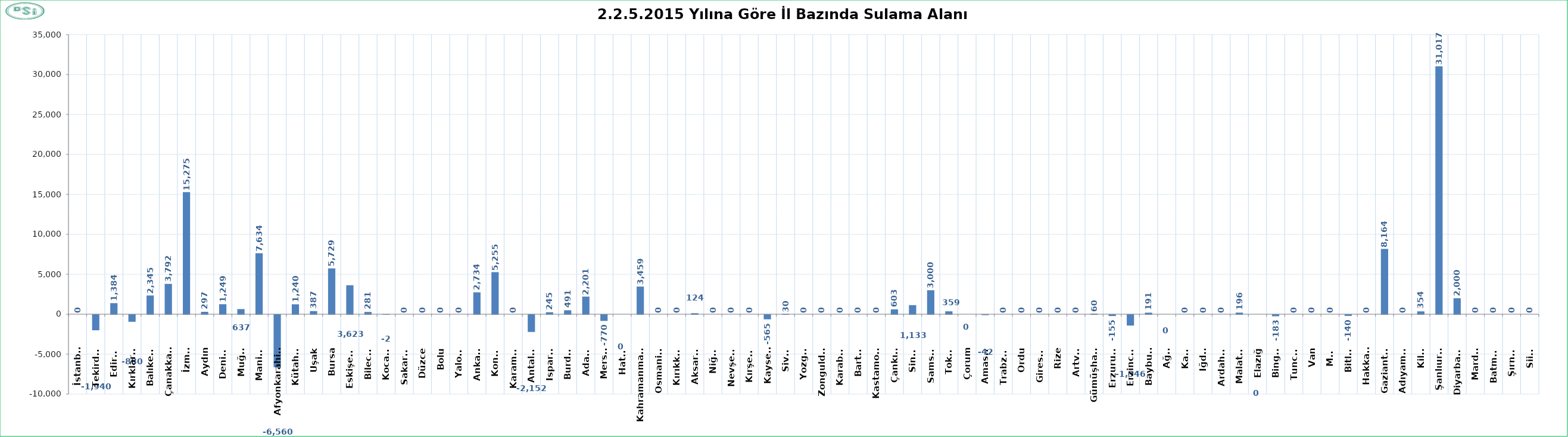
| Category | Series 0 |
|---|---|
| İstanbul | 0 |
| Tekirdağ | -1940 |
| Edirne | 1384 |
| Kırklareli | -880 |
| Balıkesir | 2345 |
| Çanakkale | 3792 |
| İzmir | 15275 |
| Aydın | 297 |
| Denizli | 1249 |
| Muğla | 637 |
| Manisa | 7634 |
| Afyonkarahisar | -6560 |
| Kütahya | 1240 |
| Uşak | 387 |
| Bursa | 5729 |
| Eskişehir | 3623 |
| Bilecik | 281 |
| Kocaeli | -2 |
| Sakarya | 0 |
| Düzce | 0 |
| Bolu | 0 |
| Yalova | 0 |
| Ankara | 2734 |
| Konya | 5255 |
| Karaman | 0 |
| Antalya | -2152 |
| Isparta | 245 |
| Burdur | 491 |
| Adana | 2201 |
| Mersin | -770 |
| Hatay | 0 |
| Kahramanmaraş | 3459 |
| Osmaniye | 0 |
| Kırıkkale | 0 |
| Aksaray | 124 |
| Niğde | 0 |
| Nevşehir | 0 |
| Kırşehir | 0 |
| Kayseri | -565 |
| Sivas | 30 |
| Yozgat | 0 |
| Zonguldak | 0 |
| Karabük | 0 |
| Bartın | 0 |
| Kastamonu | 0 |
| Çankırı | 603 |
| Sinop | 1133 |
| Samsun | 3000 |
| Tokat | 359 |
| Çorum | 0 |
| Amasya | -42 |
| Trabzon | 0 |
| Ordu | 0 |
| Giresun | 0 |
| Rize | 0 |
| Artvin | 0 |
| Gümüşhane | 60 |
| Erzurum | -155 |
| Erzincan | -1346 |
| Bayburt | 191 |
| Ağrı | 0 |
| Kars | 0 |
| Iğdır | 0 |
| Ardahan | 0 |
| Malatya | 196 |
| Elazığ | 0 |
| Bingöl | -183 |
| Tunceli | 0 |
| Van | 0 |
| Muş | 0 |
| Bitlis | -140 |
| Hakkari | 0 |
| Gaziantep | 8164 |
| Adıyaman | 0 |
| Kilis | 354 |
| Şanlıurfa | 31017 |
| Diyarbakır | 2000 |
| Mardin | 0 |
| Batman | 0 |
| Şırnak | 0 |
| Siirt | 0 |